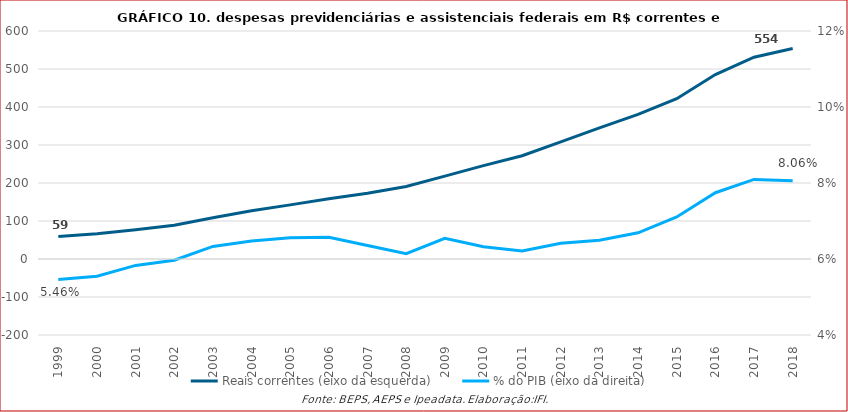
| Category | Reais correntes (eixo da esquerda) |
|---|---|
| 1999.0 | 59406057958.14 |
| 2000.0 | 66482849342.973 |
| 2001.0 | 76729748945.677 |
| 2002.0 | 88845922291.37 |
| 2003.0 | 108764026058 |
| 2004.0 | 126741962826 |
| 2005.0 | 142438895806 |
| 2006.0 | 158407170923.43 |
| 2007.0 | 172901871836.9 |
| 2008.0 | 190974641218.86 |
| 2009.0 | 218086286439.2 |
| 2010.0 | 245736151043.89 |
| 2011.0 | 271778742827.26 |
| 2012.0 | 308394340222.1 |
| 2013.0 | 345115251812.67 |
| 2014.0 | 380493141953.49 |
| 2015.0 | 421885627000 |
| 2016.0 | 485265079000 |
| 2017.0 | 531142558000 |
| 2018.0 | 553950516529.129 |